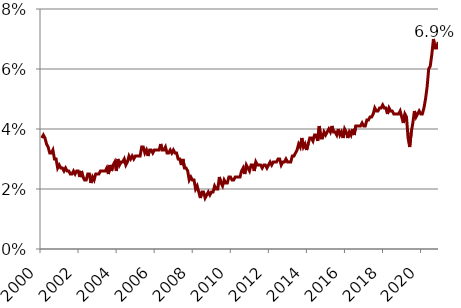
| Category | Series 0 |
|---|---|
| 2000.0 | 0.037 |
| 2001.0 | 0.038 |
| 2001.0 | 0.037 |
| 2001.0 | 0.035 |
| 2001.0 | 0.034 |
| 2001.0 | 0.032 |
| 2001.0 | 0.032 |
| 2001.0 | 0.033 |
| 2001.0 | 0.03 |
| 2001.0 | 0.03 |
| 2001.0 | 0.027 |
| 2001.0 | 0.028 |
| 2001.0 | 0.027 |
| 2002.0 | 0.027 |
| 2002.0 | 0.026 |
| 2002.0 | 0.027 |
| 2002.0 | 0.026 |
| 2002.0 | 0.026 |
| 2002.0 | 0.025 |
| 2002.0 | 0.025 |
| 2002.0 | 0.026 |
| 2002.0 | 0.025 |
| 2002.0 | 0.026 |
| 2002.0 | 0.026 |
| 2002.0 | 0.024 |
| 2003.0 | 0.026 |
| 2003.0 | 0.024 |
| 2003.0 | 0.023 |
| 2003.0 | 0.023 |
| 2003.0 | 0.025 |
| 2003.0 | 0.025 |
| 2003.0 | 0.022 |
| 2003.0 | 0.024 |
| 2003.0 | 0.023 |
| 2003.0 | 0.025 |
| 2003.0 | 0.025 |
| 2003.0 | 0.025 |
| 2004.0 | 0.026 |
| 2004.0 | 0.026 |
| 2004.0 | 0.026 |
| 2004.0 | 0.026 |
| 2004.0 | 0.027 |
| 2004.0 | 0.025 |
| 2004.0 | 0.028 |
| 2004.0 | 0.026 |
| 2004.0 | 0.028 |
| 2004.0 | 0.029 |
| 2004.0 | 0.026 |
| 2004.0 | 0.03 |
| 2005.0 | 0.028 |
| 2005.0 | 0.029 |
| 2005.0 | 0.029 |
| 2005.0 | 0.03 |
| 2005.0 | 0.028 |
| 2005.0 | 0.029 |
| 2005.0 | 0.031 |
| 2005.0 | 0.03 |
| 2005.0 | 0.031 |
| 2005.0 | 0.03 |
| 2005.0 | 0.031 |
| 2005.0 | 0.031 |
| 2006.0 | 0.031 |
| 2006.0 | 0.031 |
| 2006.0 | 0.034 |
| 2006.0 | 0.034 |
| 2006.0 | 0.032 |
| 2006.0 | 0.033 |
| 2006.0 | 0.031 |
| 2006.0 | 0.033 |
| 2006.0 | 0.033 |
| 2006.0 | 0.032 |
| 2006.0 | 0.033 |
| 2006.0 | 0.033 |
| 2007.0 | 0.033 |
| 2007.0 | 0.033 |
| 2007.0 | 0.035 |
| 2007.0 | 0.033 |
| 2007.0 | 0.033 |
| 2007.0 | 0.034 |
| 2007.0 | 0.032 |
| 2007.0 | 0.032 |
| 2007.0 | 0.033 |
| 2007.0 | 0.032 |
| 2007.0 | 0.033 |
| 2007.0 | 0.032 |
| 2008.0 | 0.032 |
| 2008.0 | 0.03 |
| 2008.0 | 0.03 |
| 2008.0 | 0.028 |
| 2008.0 | 0.03 |
| 2008.0 | 0.027 |
| 2008.0 | 0.027 |
| 2008.0 | 0.026 |
| 2008.0 | 0.023 |
| 2008.0 | 0.024 |
| 2008.0 | 0.023 |
| 2008.0 | 0.023 |
| 2009.0 | 0.02 |
| 2009.0 | 0.021 |
| 2009.0 | 0.019 |
| 2009.0 | 0.017 |
| 2009.0 | 0.019 |
| 2009.0 | 0.019 |
| 2009.0 | 0.017 |
| 2009.0 | 0.018 |
| 2009.0 | 0.019 |
| 2009.0 | 0.018 |
| 2009.0 | 0.019 |
| 2009.0 | 0.019 |
| 2010.0 | 0.021 |
| 2010.0 | 0.02 |
| 2010.0 | 0.02 |
| 2010.0 | 0.024 |
| 2010.0 | 0.022 |
| 2010.0 | 0.021 |
| 2010.0 | 0.023 |
| 2010.0 | 0.022 |
| 2010.0 | 0.022 |
| 2010.0 | 0.024 |
| 2010.0 | 0.024 |
| 2010.0 | 0.023 |
| 2011.0 | 0.023 |
| 2011.0 | 0.024 |
| 2011.0 | 0.024 |
| 2011.0 | 0.024 |
| 2011.0 | 0.024 |
| 2011.0 | 0.026 |
| 2011.0 | 0.027 |
| 2011.0 | 0.025 |
| 2011.0 | 0.028 |
| 2011.0 | 0.027 |
| 2011.0 | 0.026 |
| 2011.0 | 0.028 |
| 2012.0 | 0.028 |
| 2012.0 | 0.026 |
| 2012.0 | 0.029 |
| 2012.0 | 0.028 |
| 2012.0 | 0.028 |
| 2012.0 | 0.028 |
| 2012.0 | 0.027 |
| 2012.0 | 0.028 |
| 2012.0 | 0.028 |
| 2012.0 | 0.027 |
| 2012.0 | 0.028 |
| 2012.0 | 0.029 |
| 2013.0 | 0.028 |
| 2013.0 | 0.029 |
| 2013.0 | 0.029 |
| 2013.0 | 0.029 |
| 2013.0 | 0.03 |
| 2013.0 | 0.03 |
| 2013.0 | 0.028 |
| 2013.0 | 0.029 |
| 2013.0 | 0.029 |
| 2013.0 | 0.03 |
| 2013.0 | 0.029 |
| 2013.0 | 0.029 |
| 2014.0 | 0.029 |
| 2014.0 | 0.031 |
| 2014.0 | 0.031 |
| 2014.0 | 0.032 |
| 2014.0 | 0.033 |
| 2014.0 | 0.035 |
| 2014.0 | 0.034 |
| 2014.0 | 0.037 |
| 2014.0 | 0.034 |
| 2014.0 | 0.035 |
| 2014.0 | 0.033 |
| 2014.0 | 0.035 |
| 2015.0 | 0.037 |
| 2015.0 | 0.037 |
| 2015.0 | 0.036 |
| 2015.0 | 0.038 |
| 2015.0 | 0.038 |
| 2015.0 | 0.036 |
| 2015.0 | 0.041 |
| 2015.0 | 0.037 |
| 2015.0 | 0.037 |
| 2015.0 | 0.039 |
| 2015.0 | 0.038 |
| 2015.0 | 0.039 |
| 2016.0 | 0.04 |
| 2016.0 | 0.039 |
| 2016.0 | 0.041 |
| 2016.0 | 0.039 |
| 2016.0 | 0.039 |
| 2016.0 | 0.038 |
| 2016.0 | 0.04 |
| 2016.0 | 0.038 |
| 2016.0 | 0.039 |
| 2016.0 | 0.037 |
| 2016.0 | 0.04 |
| 2016.0 | 0.039 |
| 2017.0 | 0.037 |
| 2017.0 | 0.039 |
| 2017.0 | 0.038 |
| 2017.0 | 0.04 |
| 2017.0 | 0.038 |
| 2017.0 | 0.041 |
| 2017.0 | 0.041 |
| 2017.0 | 0.041 |
| 2017.0 | 0.041 |
| 2017.0 | 0.042 |
| 2017.0 | 0.041 |
| 2017.0 | 0.041 |
| 2018.0 | 0.043 |
| 2018.0 | 0.043 |
| 2018.0 | 0.044 |
| 2018.0 | 0.044 |
| 2018.0 | 0.045 |
| 2018.0 | 0.047 |
| 2018.0 | 0.046 |
| 2018.0 | 0.046 |
| 2018.0 | 0.047 |
| 2018.0 | 0.047 |
| 2018.0 | 0.048 |
| 2018.0 | 0.047 |
| 2019.0 | 0.047 |
| 2019.0 | 0.045 |
| 2019.0 | 0.047 |
| 2019.0 | 0.046 |
| 2019.0 | 0.046 |
| 2019.0 | 0.045 |
| 2019.0 | 0.045 |
| 2019.0 | 0.045 |
| 2019.0 | 0.045 |
| 2019.0 | 0.046 |
| 2019.0 | 0.044 |
| 2019.0 | 0.042 |
| 2020.0 | 0.045 |
| 2020.0 | 0.044 |
| 2020.0 | 0.037 |
| 2020.0 | 0.034 |
| 2020.0 | 0.039 |
| 2020.0 | 0.042 |
| 2020.0 | 0.046 |
| 2020.0 | 0.044 |
| 2020.0 | 0.045 |
| 2020.0 | 0.046 |
| 2020.0 | 0.045 |
| 2020.0 | 0.045 |
| 2021.0 | 0.047 |
| 2021.0 | 0.05 |
| 2021.0 | 0.054 |
| 2021.0 | 0.06 |
| 2021.0 | 0.061 |
| 2021.0 | 0.065 |
| 2021.0 | 0.07 |
| 2021.0 | 0.067 |
| 2021.0 | 0.067 |
| 2021.0 | 0.069 |